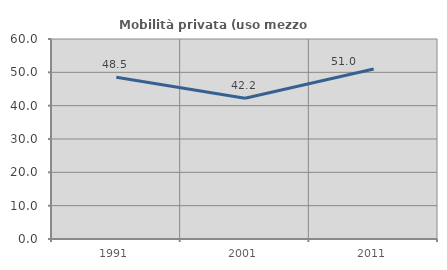
| Category | Mobilità privata (uso mezzo privato) |
|---|---|
| 1991.0 | 48.536 |
| 2001.0 | 42.247 |
| 2011.0 | 51.011 |